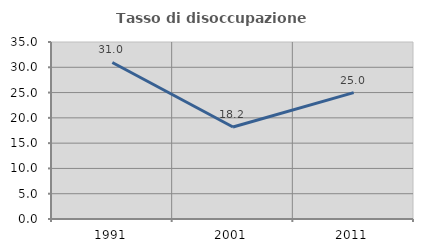
| Category | Tasso di disoccupazione giovanile  |
|---|---|
| 1991.0 | 30.952 |
| 2001.0 | 18.182 |
| 2011.0 | 25 |